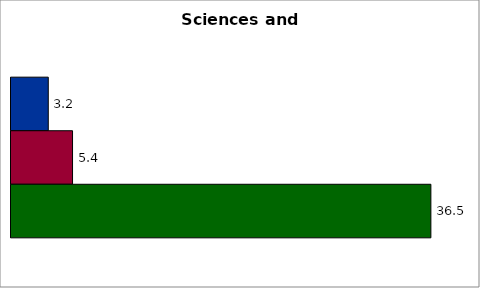
| Category | 50 states and D.C. | SREB states | Series 2 |
|---|---|---|---|
| 0 | 3.241 | 5.351 | 36.512 |